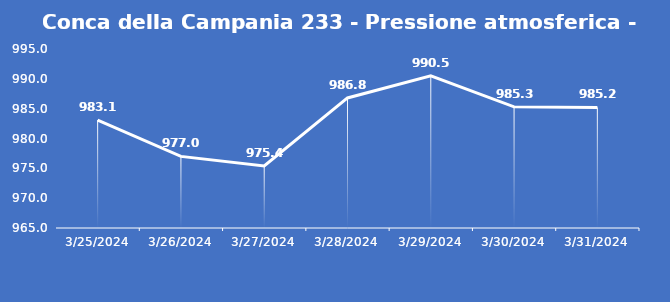
| Category | Conca della Campania 233 - Pressione atmosferica - Grezzo (hPa) |
|---|---|
| 3/25/24 | 983.1 |
| 3/26/24 | 977 |
| 3/27/24 | 975.4 |
| 3/28/24 | 986.8 |
| 3/29/24 | 990.5 |
| 3/30/24 | 985.3 |
| 3/31/24 | 985.2 |